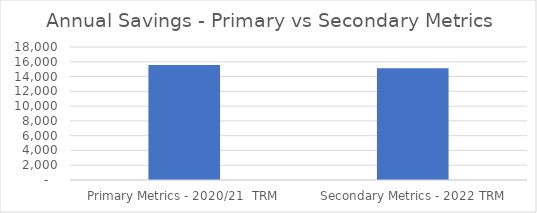
| Category | Series 0 |
|---|---|
| Primary Metrics - 2020/21  TRM | 15553.703 |
| Secondary Metrics - 2022 TRM | 15117.805 |